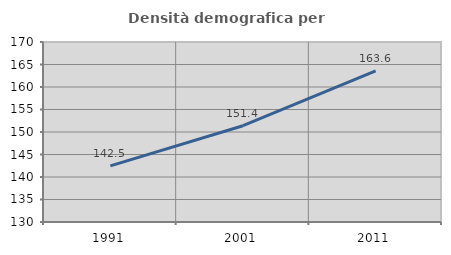
| Category | Densità demografica |
|---|---|
| 1991.0 | 142.473 |
| 2001.0 | 151.401 |
| 2011.0 | 163.568 |